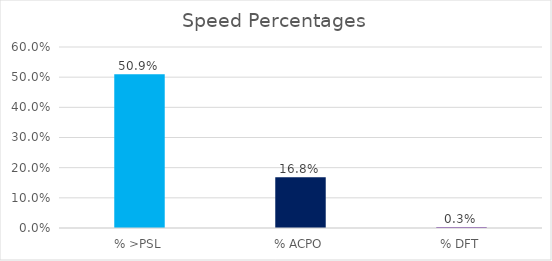
| Category | Series 0 |
|---|---|
| % >PSL | 0.509 |
| % ACPO | 0.168 |
| % DFT | 0.003 |